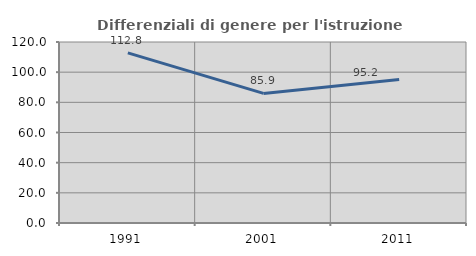
| Category | Differenziali di genere per l'istruzione superiore |
|---|---|
| 1991.0 | 112.769 |
| 2001.0 | 85.912 |
| 2011.0 | 95.197 |